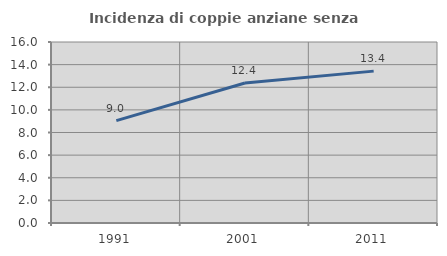
| Category | Incidenza di coppie anziane senza figli  |
|---|---|
| 1991.0 | 9.049 |
| 2001.0 | 12.373 |
| 2011.0 | 13.425 |